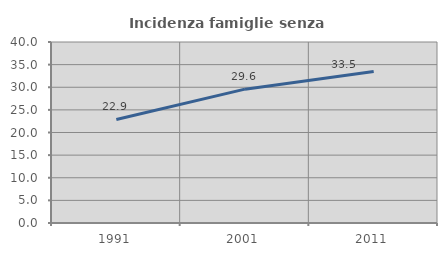
| Category | Incidenza famiglie senza nuclei |
|---|---|
| 1991.0 | 22.885 |
| 2001.0 | 29.579 |
| 2011.0 | 33.473 |